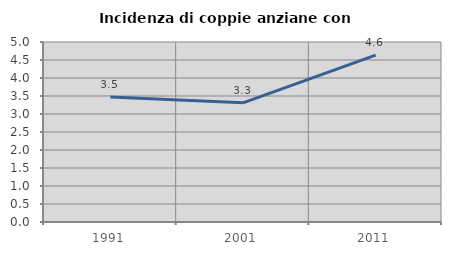
| Category | Incidenza di coppie anziane con figli |
|---|---|
| 1991.0 | 3.472 |
| 2001.0 | 3.311 |
| 2011.0 | 4.636 |